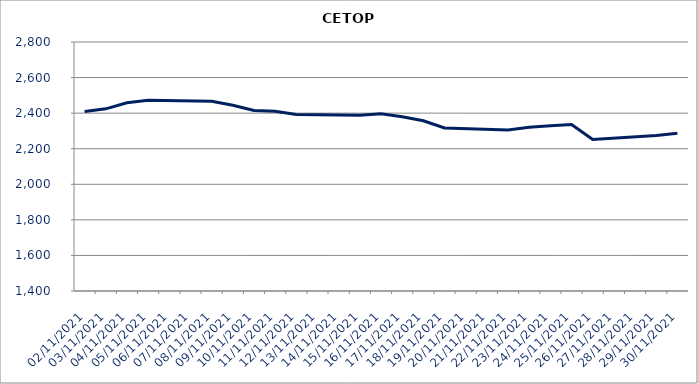
| Category | CETOP |
|---|---|
| 02/11/2021 | 2408.72 |
| 03/11/2021 | 2424.17 |
| 04/11/2021 | 2458.38 |
| 05/11/2021 | 2472.04 |
| 08/11/2021 | 2466.46 |
| 09/11/2021 | 2444.82 |
| 10/11/2021 | 2415.2 |
| 11/11/2021 | 2410.85 |
| 12/11/2021 | 2392.43 |
| 15/11/2021 | 2387.91 |
| 16/11/2021 | 2396.61 |
| 17/11/2021 | 2380.24 |
| 18/11/2021 | 2357.21 |
| 19/11/2021 | 2316.67 |
| 22/11/2021 | 2304.75 |
| 23/11/2021 | 2320.13 |
| 24/11/2021 | 2329.46 |
| 25/11/2021 | 2336.06 |
| 26/11/2021 | 2251.73 |
| 29/11/2021 | 2274.83 |
| 30/11/2021 | 2286.44 |